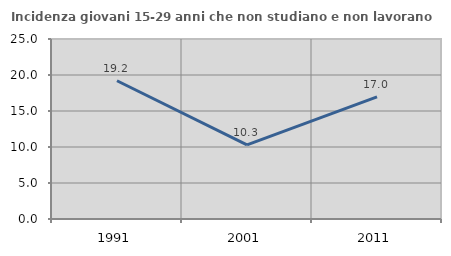
| Category | Incidenza giovani 15-29 anni che non studiano e non lavorano  |
|---|---|
| 1991.0 | 19.204 |
| 2001.0 | 10.289 |
| 2011.0 | 16.955 |